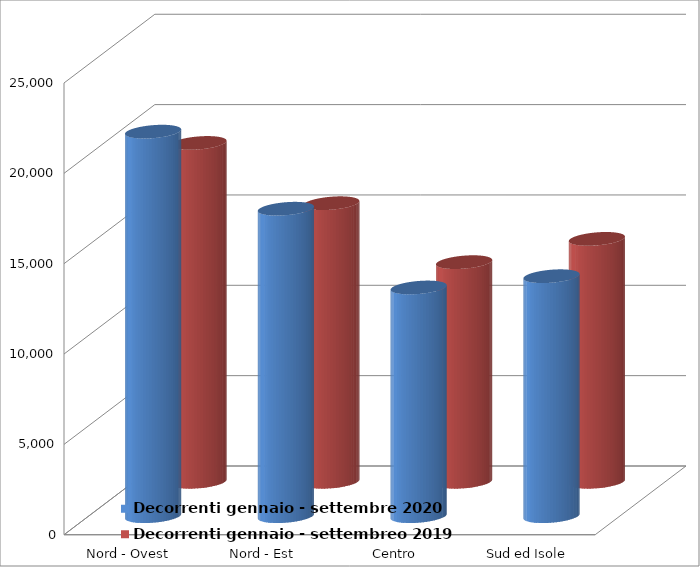
| Category | Decorrenti gennaio - settembre 2020 | Decorrenti gennaio - settembreo 2019 |
|---|---|---|
| Nord - Ovest | 21280 | 18753 |
| Nord - Est | 17015 | 15418 |
| Centro | 12657 | 12156 |
| Sud ed Isole | 13280 | 13445 |